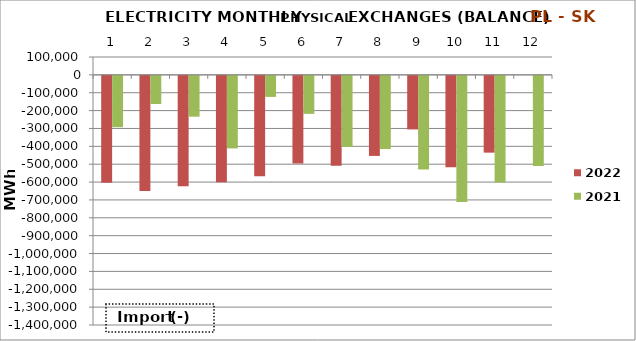
| Category | 2022 | 2021 |
|---|---|---|
| 0 | -597977.6 | -287338 |
| 1 | -644520.9 | -157547.7 |
| 2 | -618262.3 | -228441.9 |
| 3 | -595868.9 | -406042.2 |
| 4 | -562136.2 | -117752.6 |
| 5 | -489812.2 | -212627.3 |
| 6 | -502689.6 | -397826.2 |
| 7 | -447989.1 | -409369 |
| 8 | -299789.3 | -524163.2 |
| 9 | -511613.4 | -706343.1 |
| 10 | -429710.4 | -597388.5 |
| 11 | 0 | -504089.8 |